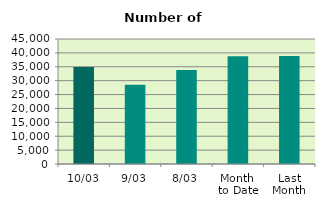
| Category | Series 0 |
|---|---|
| 10/03 | 34930 |
| 9/03 | 28538 |
| 8/03 | 33820 |
| Month 
to Date | 38780.25 |
| Last
Month | 38877.2 |